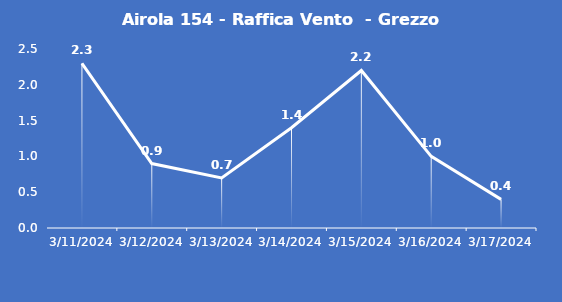
| Category | Airola 154 - Raffica Vento  - Grezzo (m/s) |
|---|---|
| 3/11/24 | 2.3 |
| 3/12/24 | 0.9 |
| 3/13/24 | 0.7 |
| 3/14/24 | 1.4 |
| 3/15/24 | 2.2 |
| 3/16/24 | 1 |
| 3/17/24 | 0.4 |